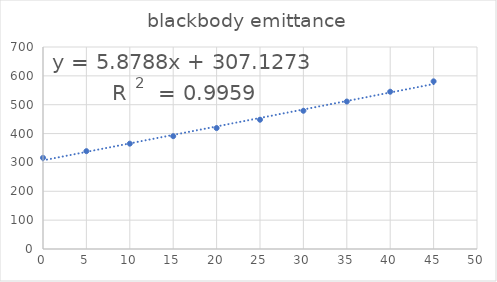
| Category | blackbody emittance |
|---|---|
| 0.0 | 316 |
| 5.0 | 339 |
| 10.0 | 365 |
| 15.0 | 391 |
| 20.0 | 419 |
| 25.0 | 448 |
| 30.0 | 479 |
| 35.0 | 511 |
| 40.0 | 545 |
| 45.0 | 581 |